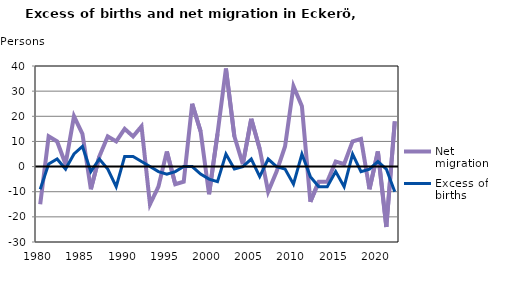
| Category | Net migration | Excess of births |
|---|---|---|
| 1980.0 | -15 | -9 |
| 1981.0 | 12 | 1 |
| 1982.0 | 10 | 3 |
| 1983.0 | 1 | -1 |
| 1984.0 | 20 | 5 |
| 1985.0 | 13 | 8 |
| 1986.0 | -9 | -2 |
| 1987.0 | 4 | 3 |
| 1988.0 | 12 | -1 |
| 1989.0 | 10 | -8 |
| 1990.0 | 15 | 4 |
| 1991.0 | 12 | 4 |
| 1992.0 | 16 | 2 |
| 1993.0 | -15 | 0 |
| 1994.0 | -8 | -2 |
| 1995.0 | 6 | -3 |
| 1996.0 | -7 | -2 |
| 1997.0 | -6 | 0 |
| 1998.0 | 25 | 0 |
| 1999.0 | 14 | -3 |
| 2000.0 | -11 | -5 |
| 2001.0 | 13 | -6 |
| 2002.0 | 39 | 5 |
| 2003.0 | 12 | -1 |
| 2004.0 | 1 | 0 |
| 2005.0 | 19 | 3 |
| 2006.0 | 7 | -4 |
| 2007.0 | -10 | 3 |
| 2008.0 | -2 | 0 |
| 2009.0 | 8 | -1 |
| 2010.0 | 32 | -7 |
| 2011.0 | 24 | 5 |
| 2012.0 | -14 | -4 |
| 2013.0 | -6 | -8 |
| 2014.0 | -6 | -8 |
| 2015.0 | 2 | -2 |
| 2016.0 | 1 | -8 |
| 2017.0 | 10 | 5 |
| 2018.0 | 11 | -2 |
| 2019.0 | -9 | -1 |
| 2020.0 | 6 | 2 |
| 2021.0 | -24 | -1 |
| 2022.0 | 18 | -10 |